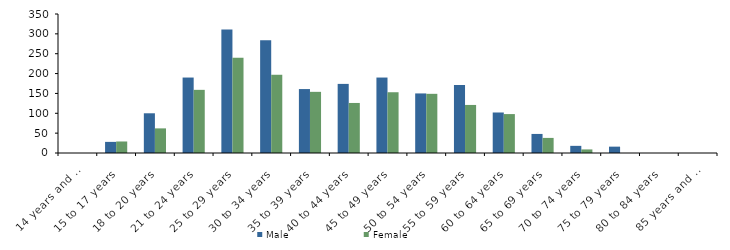
| Category | Male | Female |
|---|---|---|
| 14 years and under | 0 | 0 |
| 15 to 17 years | 28 | 29 |
| 18 to 20 years | 100 | 62 |
| 21 to 24 years | 190 | 159 |
| 25 to 29 years | 311 | 240 |
| 30 to 34 years | 284 | 197 |
| 35 to 39 years | 161 | 154 |
| 40 to 44 years | 174 | 126 |
| 45 to 49 years | 190 | 153 |
| 50 to 54 years | 150 | 149 |
| 55 to 59 years | 171 | 121 |
| 60 to 64 years | 102 | 98 |
| 65 to 69 years | 48 | 38 |
| 70 to 74 years | 18 | 9 |
| 75 to 79 years | 16 | 0 |
| 80 to 84 years | 0 | 0 |
| 85 years and over | 0 | 0 |